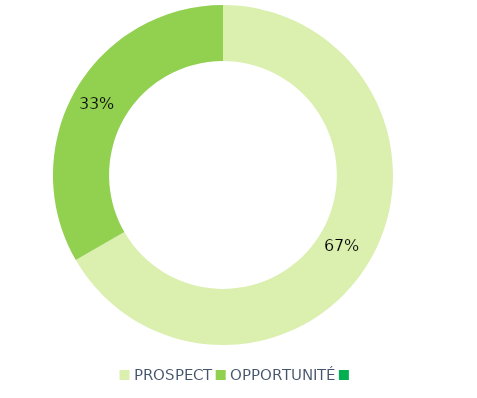
| Category | Series 0 |
|---|---|
| PROSPECT | 44 |
| OPPORTUNITÉ | 22 |